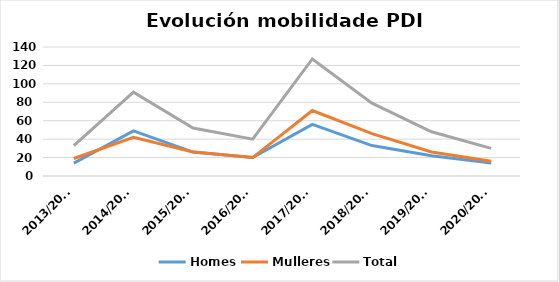
| Category | Homes | Mulleres | Total |
|---|---|---|---|
| 2013/2014 | 14 | 19 | 33 |
| 2014/2015 | 49 | 42 | 91 |
| 2015/2016 | 26 | 26 | 52 |
| 2016/2017 | 20 | 20 | 40 |
| 2017/2018 | 56 | 71 | 127 |
| 2018/2019 | 33 | 46 | 79 |
| 2019/2020 | 22 | 26 | 48 |
| 2020/2021 | 14 | 16 | 30 |